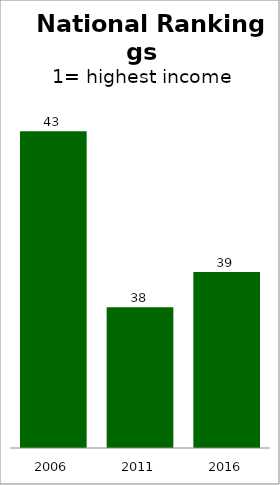
| Category | Series 0 |
|---|---|
| 2006.0 | 43 |
| 2011.0 | 38 |
| 2016.0 | 39 |